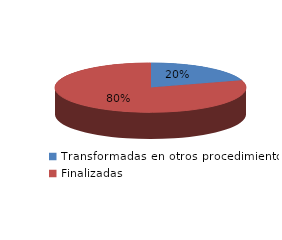
| Category | Series 0 |
|---|---|
| Transformadas en otros procedimientos | 1849 |
| Finalizadas | 7351 |